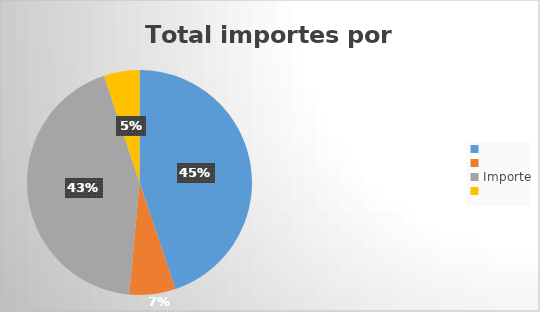
| Category | Total xeral |
|---|---|
| 0 | 7955237.65 |
| 1 | 1177312.9 |
| 2 | 7713328.23 |
| 3 | 905551.63 |